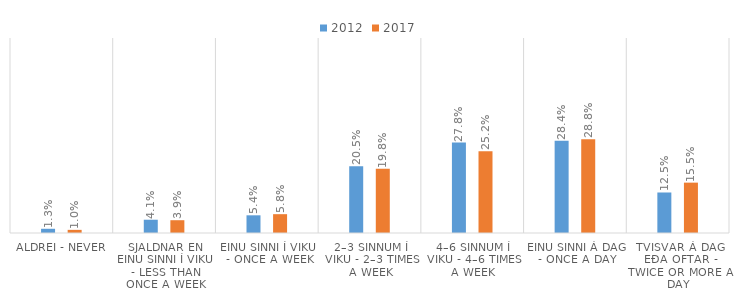
| Category | 2012 | 2017 |
|---|---|---|
| Aldrei - Never | 0.013 | 0.01 |
| Sjaldnar en einu sinni í viku - Less than once a week | 0.041 | 0.039 |
| Einu sinni í viku - Once a week | 0.054 | 0.058 |
| 2–3 sinnum í viku - 2–3 times a week | 0.205 | 0.198 |
| 4–6 sinnum í viku - 4–6 times a week | 0.278 | 0.252 |
| Einu sinni á dag - Once a day | 0.284 | 0.288 |
| Tvisvar á dag eða oftar - Twice or more a day | 0.125 | 0.155 |